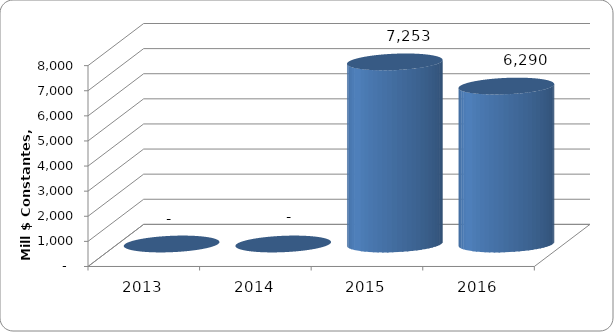
| Category | SALDO DE DEUDA |
|---|---|
| 2013.0 | 0 |
| 2014.0 | 0 |
| 2015.0 | 7252.851 |
| 2016.0 | 6290 |